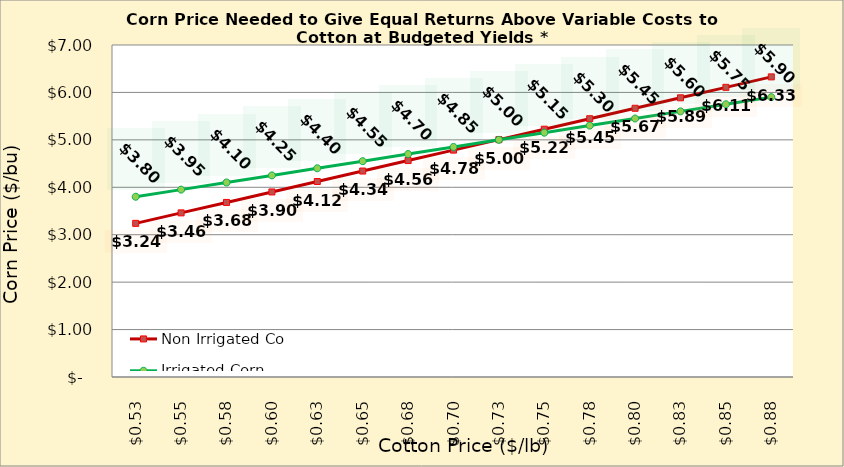
| Category | Non Irrigated Corn | Irrigated Corn |
|---|---|---|
| 0.5249999999999998 | 3.24 | 3.801 |
| 0.5499999999999998 | 3.46 | 3.951 |
| 0.5749999999999998 | 3.681 | 4.101 |
| 0.5999999999999999 | 3.901 | 4.251 |
| 0.6249999999999999 | 4.122 | 4.401 |
| 0.6499999999999999 | 4.343 | 4.551 |
| 0.6749999999999999 | 4.563 | 4.701 |
| 0.7 | 4.784 | 4.851 |
| 0.725 | 5.004 | 5.001 |
| 0.75 | 5.225 | 5.151 |
| 0.775 | 5.445 | 5.301 |
| 0.8 | 5.666 | 5.451 |
| 0.8250000000000001 | 5.887 | 5.601 |
| 0.8500000000000001 | 6.107 | 5.751 |
| 0.8750000000000001 | 6.328 | 5.901 |